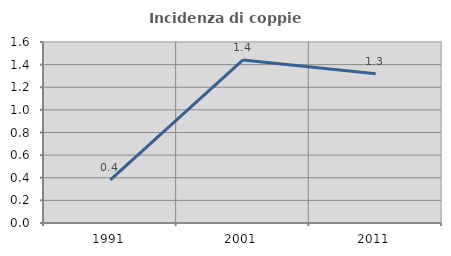
| Category | Incidenza di coppie miste |
|---|---|
| 1991.0 | 0.381 |
| 2001.0 | 1.442 |
| 2011.0 | 1.32 |